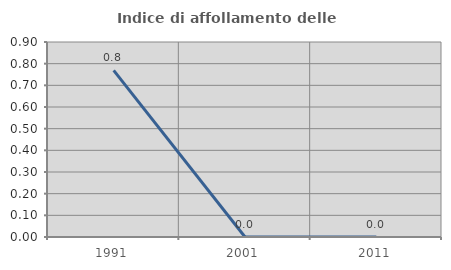
| Category | Indice di affollamento delle abitazioni  |
|---|---|
| 1991.0 | 0.769 |
| 2001.0 | 0 |
| 2011.0 | 0 |